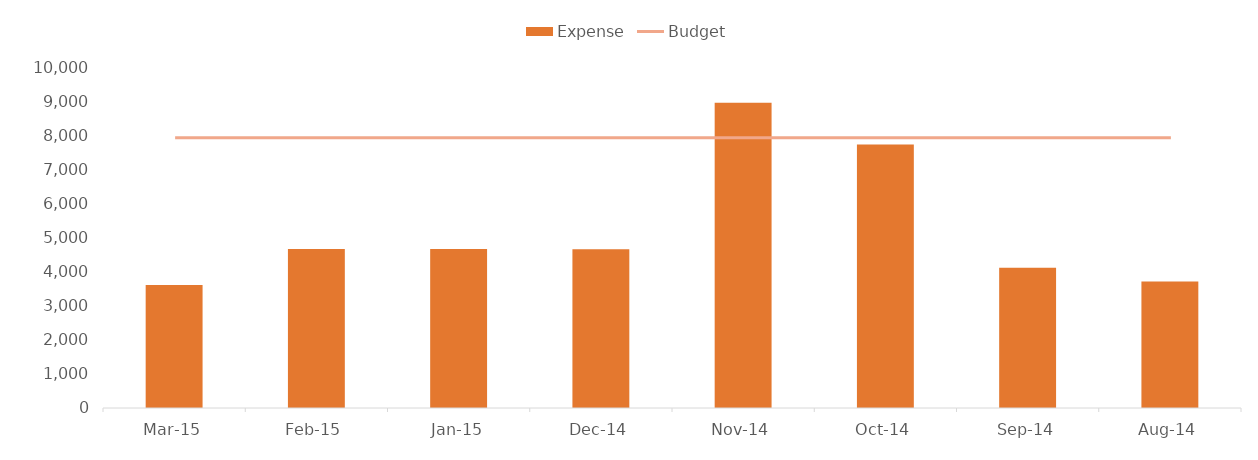
| Category | Expense |
|---|---|
| Mar-15 | 3620 |
| Feb-15 | 4680 |
| Jan-15 | 4680 |
| Dec-14 | 4670 |
| Nov-14 | 8975 |
| Oct-14 | 7750 |
| Sep-14 | 4125 |
| Aug-14 | 3720 |